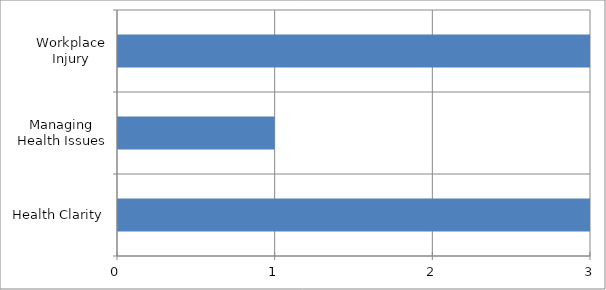
| Category | Series 0 |
|---|---|
| Health Clarity | 3 |
| Managing Health Issues | 1 |
| Workplace Injury | 3 |